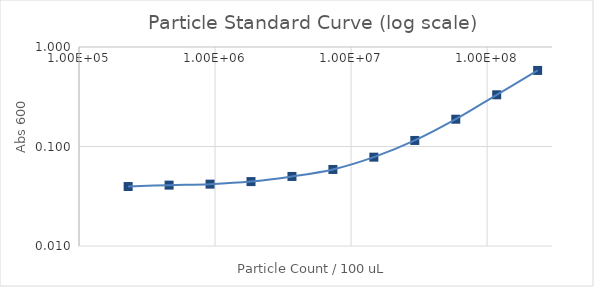
| Category | Series 1 |
|---|---|
| 235294117.64705887 | 0.581 |
| 117647058.82352944 | 0.331 |
| 58823529.41176472 | 0.188 |
| 29411764.70588236 | 0.115 |
| 14705882.35294118 | 0.078 |
| 7352941.17647059 | 0.059 |
| 3676470.588235295 | 0.05 |
| 1838235.2941176475 | 0.044 |
| 919117.6470588237 | 0.042 |
| 459558.82352941186 | 0.041 |
| 229779.41176470593 | 0.04 |